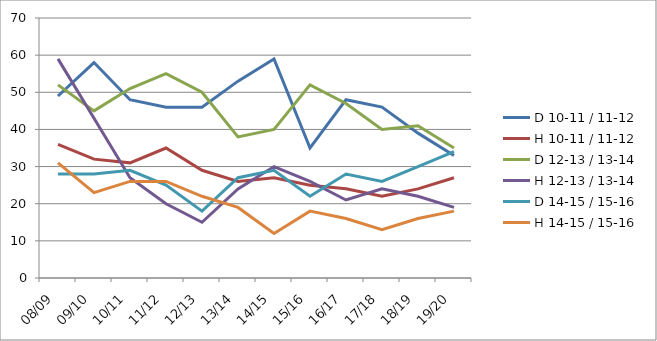
| Category | D 10-11 / 11-12 | H 10-11 / 11-12 | D 12-13 / 13-14 | H 12-13 / 13-14 | D 14-15 / 15-16 | H 14-15 / 15-16 |
|---|---|---|---|---|---|---|
| 08/09 | 49 | 36 | 52 | 59 | 28 | 31 |
| 09/10 | 58 | 32 | 45 | 43 | 28 | 23 |
| 10/11 | 48 | 31 | 51 | 27 | 29 | 26 |
| 11/12 | 46 | 35 | 55 | 20 | 25 | 26 |
| 12/13 | 46 | 29 | 50 | 15 | 18 | 22 |
| 13/14 | 53 | 26 | 38 | 24 | 27 | 19 |
| 14/15 | 59 | 27 | 40 | 30 | 29 | 12 |
| 15/16 | 35 | 25 | 52 | 26 | 22 | 18 |
| 16/17 | 48 | 24 | 47 | 21 | 28 | 16 |
| 17/18 | 46 | 22 | 40 | 24 | 26 | 13 |
| 18/19 | 39 | 24 | 41 | 22 | 30 | 16 |
| 19/20 | 33 | 27 | 35 | 19 | 34 | 18 |